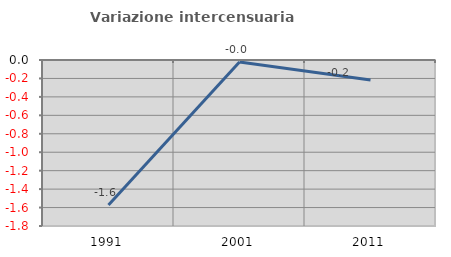
| Category | Variazione intercensuaria annua |
|---|---|
| 1991.0 | -1.572 |
| 2001.0 | -0.021 |
| 2011.0 | -0.216 |